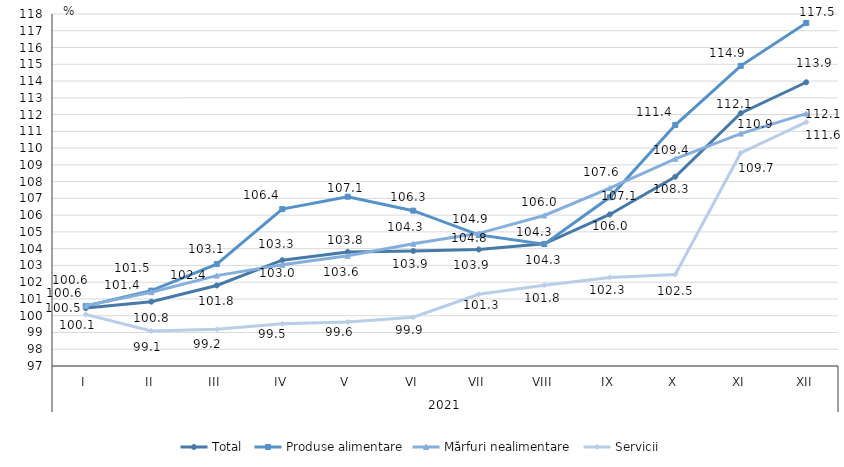
| Category | Total  | Produse alimentare | Mărfuri nealimentare  | Servicii |
|---|---|---|---|---|
| 0 | 100.456 | 100.577 | 100.604 | 100.08 |
| 1 | 100.836 | 101.497 | 101.401 | 99.094 |
| 2 | 101.804 | 103.079 | 102.392 | 99.186 |
| 3 | 103.311 | 106.358 | 103.035 | 99.519 |
| 4 | 103.806 | 107.1 | 103.572 | 99.628 |
| 5 | 103.862 | 106.267 | 104.293 | 99.91 |
| 6 | 103.95 | 104.823 | 104.915 | 101.277 |
| 7 | 104.292 | 104.27 | 105.979 | 101.815 |
| 8 | 106.042 | 107.065 | 107.615 | 102.285 |
| 9 | 108.292 | 111.376 | 109.36 | 102.463 |
| 10 | 112.081 | 114.906 | 110.868 | 109.708 |
| 11 | 113.928 | 117.461 | 112.055 | 111.555 |